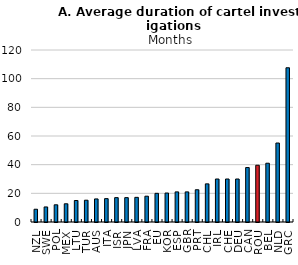
| Category | Series 0 |
|---|---|
| NZL | 8.9 |
| SWE | 10.5 |
| POL | 12 |
| MEX | 12.7 |
| LTU | 15 |
| TUR | 15.2 |
| AUS | 16.1 |
| ITA | 16.3 |
| ISR | 17 |
| JPN | 17 |
| LVA | 17.2 |
| FRA | 18 |
| EU | 20 |
| KOR | 20.2 |
| ESP | 21 |
| GBR | 21 |
| PRT | 22.5 |
| CHL | 26.6 |
| IRL | 30 |
| CHE | 30 |
| DEU | 30 |
| CAN | 38 |
| ROU | 39.6 |
| BEL | 41 |
| NLD | 55.1 |
| GRC | 107.6 |